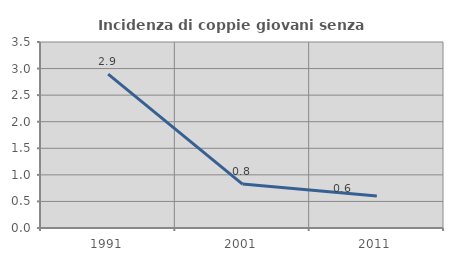
| Category | Incidenza di coppie giovani senza figli |
|---|---|
| 1991.0 | 2.894 |
| 2001.0 | 0.826 |
| 2011.0 | 0.602 |